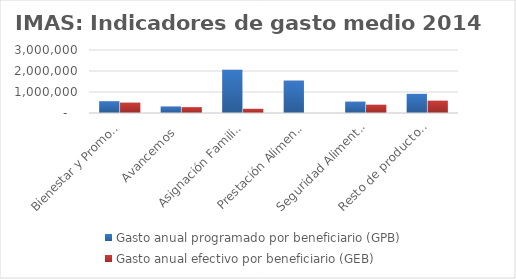
| Category | Gasto anual programado por beneficiario (GPB)  | Gasto anual efectivo por beneficiario (GEB)  |
|---|---|---|
| Bienestar y Promocion Familiar | 563432.357 | 494001.988 |
| Avancemos | 309375 | 279849.058 |
| Asignación Familiar | 2058109.458 | 200537.227 |
| Prestación Alimentaria | 1543582.094 | 0 |
| Seguridad Alimentaria | 541270.154 | 394902.052 |
| Resto de productos | 912500 | 586850.909 |